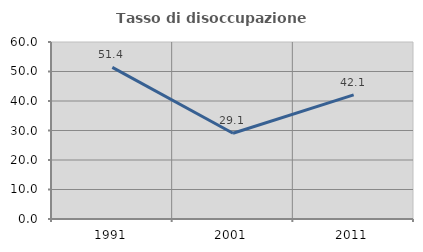
| Category | Tasso di disoccupazione giovanile  |
|---|---|
| 1991.0 | 51.412 |
| 2001.0 | 29.067 |
| 2011.0 | 42.063 |